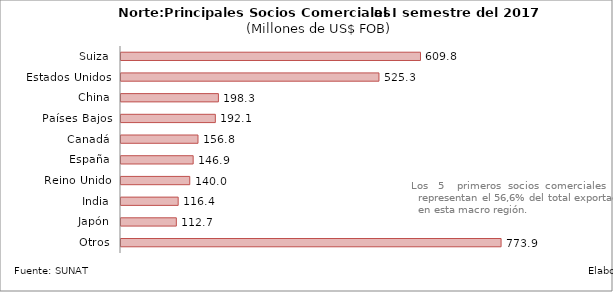
| Category | Series 0 |
|---|---|
| Suiza | 609.833 |
| Estados Unidos | 525.268 |
| China | 198.316 |
| Países Bajos | 192.091 |
| Canadá | 156.771 |
| España | 146.941 |
| Reino Unido | 140 |
| India | 116.435 |
| Japón | 112.671 |
| Otros | 773.919 |